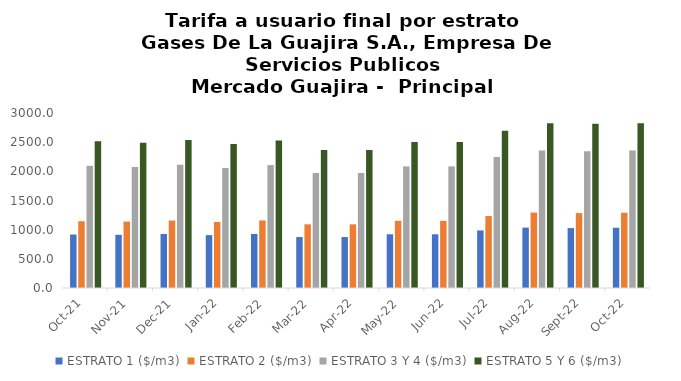
| Category | ESTRATO 1 ($/m3) | ESTRATO 2 ($/m3) | ESTRATO 3 Y 4 ($/m3) | ESTRATO 5 Y 6 ($/m3) |
|---|---|---|---|---|
| 2021-10-01 | 916.65 | 1145.13 | 2094.69 | 2513.628 |
| 2021-11-01 | 911.95 | 1138.82 | 2075.09 | 2490.108 |
| 2021-12-01 | 925.76 | 1156.56 | 2113.12 | 2535.744 |
| 2022-01-01 | 906.06 | 1131.99 | 2058.47 | 2470.164 |
| 2022-02-01 | 926.6 | 1158.16 | 2107.04 | 2528.448 |
| 2022-03-01 | 873.25 | 1091.56 | 1971.08 | 2365.296 |
| 2022-04-01 | 873.25 | 1091.56 | 1971.08 | 2365.296 |
| 2022-05-01 | 920.85 | 1151.33 | 2084.51 | 2501.412 |
| 2022-06-01 | 920.85 | 1151.33 | 2084.51 | 2501.412 |
| 2022-07-01 | 986.73 | 1232.87 | 2244.9 | 2693.88 |
| 2022-08-01 | 1035.13 | 1293.39 | 2355.1 | 2826.12 |
| 2022-09-01 | 1026.99 | 1283.72 | 2345.53 | 2814.6 |
| 2022-10-01 | 1032.88 | 1290.83 | 2355.1 | 2826.12 |